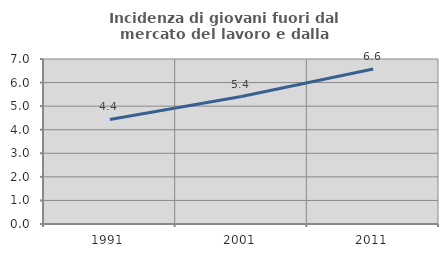
| Category | Incidenza di giovani fuori dal mercato del lavoro e dalla formazione  |
|---|---|
| 1991.0 | 4.436 |
| 2001.0 | 5.405 |
| 2011.0 | 6.573 |